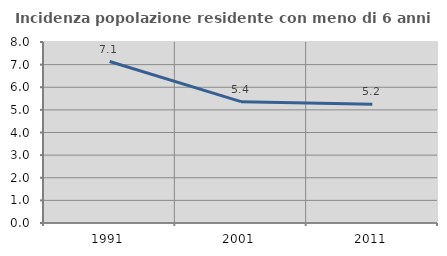
| Category | Incidenza popolazione residente con meno di 6 anni |
|---|---|
| 1991.0 | 7.137 |
| 2001.0 | 5.363 |
| 2011.0 | 5.247 |